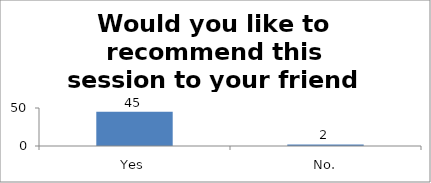
| Category | Would you like to recommend this session to your friend or colleague? |
|---|---|
| Yes | 45 |
| No. | 2 |